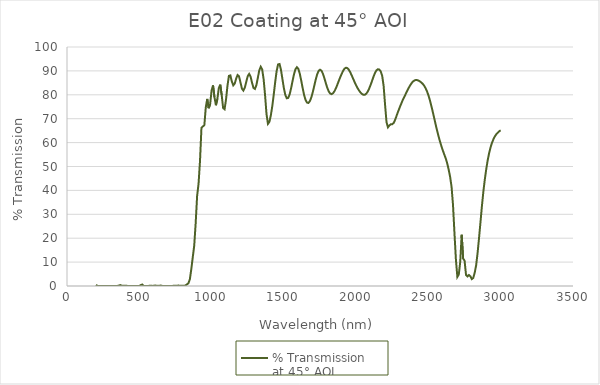
| Category | % Transmission 
at 45° AOI |
|---|---|
| 200.0 | 0.454 |
| 210.0 | 0.077 |
| 220.0 | 0.013 |
| 230.0 | 0 |
| 240.0 | 0.017 |
| 250.0 | 0.001 |
| 260.0 | 0.01 |
| 270.0 | 0.032 |
| 280.0 | 0.036 |
| 290.0 | 0.038 |
| 300.0 | 0.001 |
| 310.0 | 0.03 |
| 320.0 | 0.042 |
| 330.0 | 0.03 |
| 340.0 | 0.01 |
| 350.0 | 0.045 |
| 360.0 | 0.216 |
| 370.0 | 0.369 |
| 380.0 | 0.089 |
| 390.0 | 0.062 |
| 400.0 | 0.065 |
| 410.0 | 0.066 |
| 420.0 | 0.045 |
| 430.0 | 0.014 |
| 440.0 | 0.008 |
| 450.0 | 0.008 |
| 460.0 | 0.046 |
| 470.0 | 0.05 |
| 480.0 | 0.016 |
| 490.0 | 0.016 |
| 500.0 | 0.026 |
| 510.0 | 0.363 |
| 520.0 | 0.613 |
| 530.0 | 0.064 |
| 540.0 | 0.023 |
| 550.0 | 0.005 |
| 560.0 | 0.019 |
| 570.0 | 0.076 |
| 580.0 | 0.103 |
| 590.0 | 0.039 |
| 600.0 | 0.12 |
| 610.0 | 0.191 |
| 620.0 | 0.088 |
| 630.0 | 0.043 |
| 640.0 | 0.123 |
| 650.0 | 0.177 |
| 660.0 | 0.023 |
| 670.0 | 0.012 |
| 680.0 | 0.013 |
| 690.0 | 0.025 |
| 700.0 | 0.023 |
| 710.0 | 0.034 |
| 720.0 | 0.033 |
| 730.0 | 0.046 |
| 740.0 | 0.081 |
| 750.0 | 0.09 |
| 760.0 | 0.133 |
| 770.0 | 0.172 |
| 780.0 | 0.132 |
| 790.0 | 0.115 |
| 800.0 | 0.084 |
| 810.0 | 0.064 |
| 820.0 | 0.232 |
| 830.0 | 0.714 |
| 840.0 | 1.168 |
| 850.0 | 2.867 |
| 860.0 | 7.138 |
| 870.0 | 12.091 |
| 880.0 | 16.912 |
| 890.0 | 26.218 |
| 900.0 | 37.662 |
| 910.0 | 42.798 |
| 920.0 | 52.315 |
| 930.0 | 66.166 |
| 940.0 | 66.776 |
| 950.0 | 67.272 |
| 960.0 | 74.764 |
| 970.0 | 78.276 |
| 980.0 | 74.393 |
| 990.0 | 76.038 |
| 1000.0 | 81.755 |
| 1010.0 | 83.925 |
| 1020.0 | 79.011 |
| 1030.0 | 75.641 |
| 1040.0 | 78.213 |
| 1050.0 | 82.738 |
| 1060.0 | 84.246 |
| 1070.0 | 79.919 |
| 1080.0 | 74.447 |
| 1090.0 | 73.951 |
| 1100.0 | 78.071 |
| 1110.0 | 83.783 |
| 1120.0 | 87.92 |
| 1130.0 | 88.124 |
| 1140.0 | 85.624 |
| 1150.0 | 83.948 |
| 1160.0 | 84.679 |
| 1170.0 | 86.771 |
| 1180.0 | 88.279 |
| 1190.0 | 87.701 |
| 1200.0 | 85.162 |
| 1210.0 | 82.596 |
| 1220.0 | 81.763 |
| 1230.0 | 82.967 |
| 1240.0 | 85.408 |
| 1250.0 | 87.785 |
| 1260.0 | 88.736 |
| 1270.0 | 87.554 |
| 1280.0 | 85.024 |
| 1290.0 | 82.885 |
| 1300.0 | 82.454 |
| 1310.0 | 84.056 |
| 1320.0 | 87.117 |
| 1330.0 | 90.204 |
| 1340.0 | 91.737 |
| 1350.0 | 90.627 |
| 1360.0 | 86.531 |
| 1370.0 | 79.854 |
| 1380.0 | 71.941 |
| 1390.0 | 67.843 |
| 1400.0 | 68.675 |
| 1410.0 | 71.41 |
| 1420.0 | 75.25 |
| 1430.0 | 80.067 |
| 1440.0 | 85.304 |
| 1450.0 | 89.919 |
| 1460.0 | 92.721 |
| 1470.0 | 92.875 |
| 1480.0 | 90.447 |
| 1490.0 | 86.627 |
| 1500.0 | 82.834 |
| 1510.0 | 79.962 |
| 1520.0 | 78.546 |
| 1530.0 | 78.704 |
| 1540.0 | 80.19 |
| 1550.0 | 82.694 |
| 1560.0 | 85.716 |
| 1570.0 | 88.558 |
| 1580.0 | 90.664 |
| 1590.0 | 91.546 |
| 1600.0 | 90.893 |
| 1610.0 | 88.876 |
| 1620.0 | 85.992 |
| 1630.0 | 82.815 |
| 1640.0 | 79.94 |
| 1650.0 | 77.855 |
| 1660.0 | 76.749 |
| 1670.0 | 76.589 |
| 1680.0 | 77.359 |
| 1690.0 | 78.913 |
| 1700.0 | 81.081 |
| 1710.0 | 83.656 |
| 1720.0 | 86.267 |
| 1730.0 | 88.468 |
| 1740.0 | 89.942 |
| 1750.0 | 90.506 |
| 1760.0 | 90.087 |
| 1770.0 | 88.841 |
| 1780.0 | 87.022 |
| 1790.0 | 84.927 |
| 1800.0 | 82.983 |
| 1810.0 | 81.472 |
| 1820.0 | 80.56 |
| 1830.0 | 80.281 |
| 1840.0 | 80.642 |
| 1850.0 | 81.494 |
| 1860.0 | 82.721 |
| 1870.0 | 84.235 |
| 1880.0 | 85.836 |
| 1890.0 | 87.368 |
| 1900.0 | 88.784 |
| 1910.0 | 90.03 |
| 1920.0 | 90.973 |
| 1930.0 | 91.333 |
| 1940.0 | 91.134 |
| 1950.0 | 90.433 |
| 1960.0 | 89.325 |
| 1970.0 | 88.013 |
| 1980.0 | 86.625 |
| 1990.0 | 85.23 |
| 2000.0 | 83.92 |
| 2010.0 | 82.785 |
| 2020.0 | 81.806 |
| 2030.0 | 80.976 |
| 2040.0 | 80.358 |
| 2050.0 | 80.017 |
| 2060.0 | 80.022 |
| 2070.0 | 80.449 |
| 2080.0 | 81.343 |
| 2090.0 | 82.585 |
| 2100.0 | 84.11 |
| 2110.0 | 85.823 |
| 2120.0 | 87.563 |
| 2130.0 | 89.085 |
| 2140.0 | 90.192 |
| 2150.0 | 90.677 |
| 2160.0 | 90.558 |
| 2170.0 | 89.813 |
| 2180.0 | 88.012 |
| 2190.0 | 83.757 |
| 2200.0 | 75.916 |
| 2210.0 | 68.582 |
| 2220.0 | 66.402 |
| 2230.0 | 67.201 |
| 2240.0 | 67.67 |
| 2250.0 | 67.68 |
| 2260.0 | 68.245 |
| 2270.0 | 69.567 |
| 2280.0 | 71.277 |
| 2290.0 | 72.945 |
| 2300.0 | 74.496 |
| 2310.0 | 76.007 |
| 2320.0 | 77.476 |
| 2330.0 | 78.783 |
| 2340.0 | 80.001 |
| 2350.0 | 81.257 |
| 2360.0 | 82.474 |
| 2370.0 | 83.591 |
| 2380.0 | 84.571 |
| 2390.0 | 85.368 |
| 2400.0 | 85.885 |
| 2410.0 | 86.151 |
| 2420.0 | 86.181 |
| 2430.0 | 85.992 |
| 2440.0 | 85.666 |
| 2450.0 | 85.179 |
| 2460.0 | 84.628 |
| 2470.0 | 83.857 |
| 2480.0 | 82.786 |
| 2490.0 | 81.472 |
| 2500.0 | 79.793 |
| 2510.0 | 77.744 |
| 2520.0 | 75.387 |
| 2530.0 | 72.868 |
| 2540.0 | 70.251 |
| 2550.0 | 67.565 |
| 2560.0 | 65.003 |
| 2570.0 | 62.628 |
| 2580.0 | 60.482 |
| 2590.0 | 58.476 |
| 2600.0 | 56.648 |
| 2610.0 | 54.962 |
| 2620.0 | 53.331 |
| 2630.0 | 51.314 |
| 2640.0 | 48.707 |
| 2650.0 | 45.691 |
| 2660.0 | 41.524 |
| 2670.0 | 33.934 |
| 2680.0 | 22.219 |
| 2690.0 | 11.173 |
| 2700.0 | 3.792 |
| 2710.0 | 4.814 |
| 2720.0 | 10.11 |
| 2730.0 | 21.448 |
| 2740.0 | 11.476 |
| 2750.0 | 10.625 |
| 2760.0 | 4.648 |
| 2770.0 | 3.999 |
| 2780.0 | 4.598 |
| 2790.0 | 4.074 |
| 2800.0 | 2.901 |
| 2810.0 | 3.375 |
| 2820.0 | 5.546 |
| 2830.0 | 8.639 |
| 2840.0 | 13.802 |
| 2850.0 | 20.019 |
| 2860.0 | 26.701 |
| 2870.0 | 33.429 |
| 2880.0 | 39.494 |
| 2890.0 | 44.572 |
| 2900.0 | 48.917 |
| 2910.0 | 52.65 |
| 2920.0 | 55.618 |
| 2930.0 | 58.084 |
| 2940.0 | 59.976 |
| 2950.0 | 61.455 |
| 2960.0 | 62.653 |
| 2970.0 | 63.555 |
| 2980.0 | 64.139 |
| 2990.0 | 64.781 |
| 3000.0 | 65.103 |